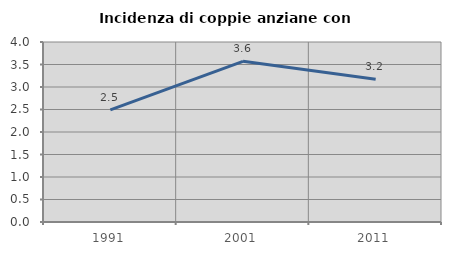
| Category | Incidenza di coppie anziane con figli |
|---|---|
| 1991.0 | 2.492 |
| 2001.0 | 3.571 |
| 2011.0 | 3.175 |